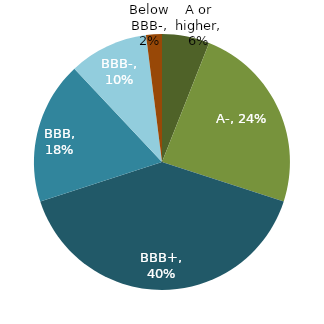
| Category | Series 0 |
|---|---|
| A or higher | 0.06 |
| A- | 0.24 |
| BBB+ | 0.4 |
| BBB | 0.18 |
| BBB- | 0.1 |
| Below BBB- | 0.02 |